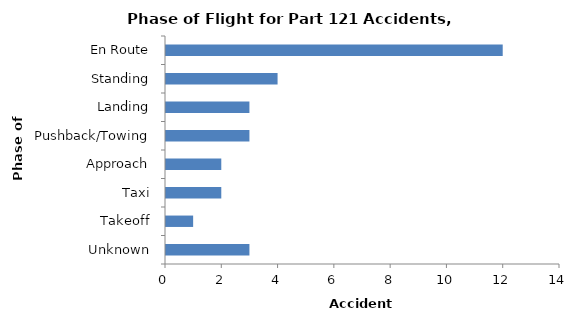
| Category | Accident Aircraft |
|---|---|
| En Route | 12 |
| Standing | 4 |
| Landing | 3 |
| Pushback/Towing | 3 |
| Approach | 2 |
| Taxi | 2 |
| Takeoff | 1 |
| Unknown | 3 |